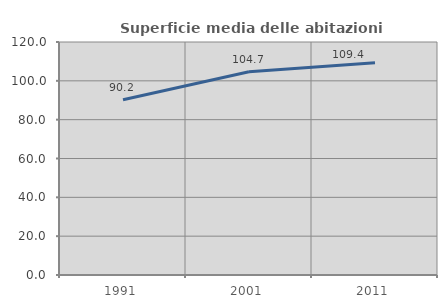
| Category | Superficie media delle abitazioni occupate |
|---|---|
| 1991.0 | 90.24 |
| 2001.0 | 104.695 |
| 2011.0 | 109.362 |